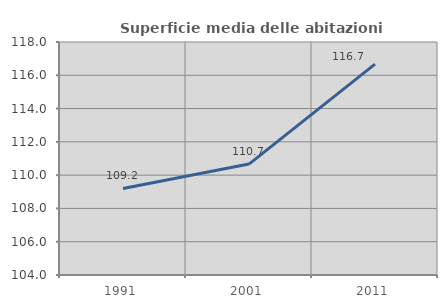
| Category | Superficie media delle abitazioni occupate |
|---|---|
| 1991.0 | 109.201 |
| 2001.0 | 110.664 |
| 2011.0 | 116.668 |